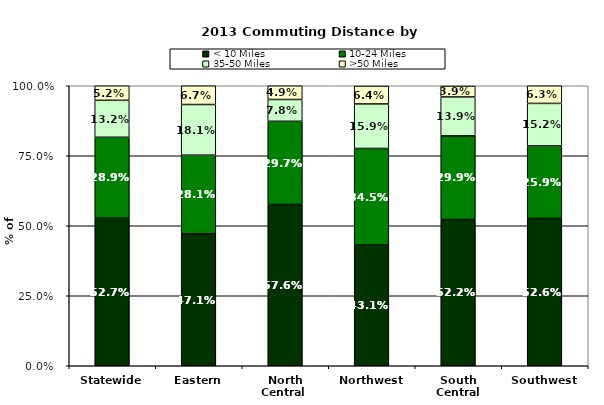
| Category | < 10 Miles | 10-24 Miles | 35-50 Miles | >50 Miles |
|---|---|---|---|---|
| Statewide | 0.527 | 0.289 | 0.132 | 0.052 |
| Eastern | 0.471 | 0.281 | 0.181 | 0.067 |
| North Central  | 0.576 | 0.297 | 0.078 | 0.049 |
| Northwest | 0.431 | 0.345 | 0.159 | 0.064 |
| South Central | 0.522 | 0.299 | 0.139 | 0.039 |
| Southwest | 0.526 | 0.259 | 0.152 | 0.063 |